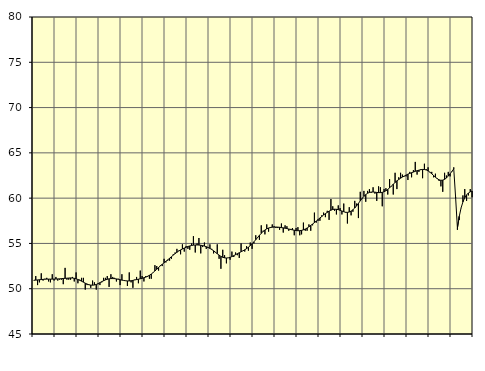
| Category | Piggar | Samtliga anställda (inkl. anställda utomlands) |
|---|---|---|
| nan | 50.9 | 50.94 |
| 1.0 | 51.4 | 50.95 |
| 1.0 | 50.4 | 50.97 |
| 1.0 | 50.7 | 50.99 |
| 1.0 | 51.7 | 51.01 |
| 1.0 | 50.9 | 51.03 |
| 1.0 | 51.1 | 51.05 |
| 1.0 | 51.2 | 51.06 |
| 1.0 | 50.8 | 51.06 |
| 1.0 | 50.7 | 51.06 |
| 1.0 | 51.6 | 51.06 |
| 1.0 | 50.9 | 51.06 |
| nan | 51.3 | 51.07 |
| 2.0 | 50.9 | 51.08 |
| 2.0 | 51 | 51.09 |
| 2.0 | 51 | 51.11 |
| 2.0 | 50.5 | 51.13 |
| 2.0 | 52.3 | 51.15 |
| 2.0 | 51 | 51.16 |
| 2.0 | 51 | 51.18 |
| 2.0 | 51 | 51.19 |
| 2.0 | 51.3 | 51.18 |
| 2.0 | 50.8 | 51.15 |
| 2.0 | 51.8 | 51.1 |
| nan | 50.6 | 51.02 |
| 3.0 | 51 | 50.93 |
| 3.0 | 51.2 | 50.83 |
| 3.0 | 51.2 | 50.72 |
| 3.0 | 49.9 | 50.61 |
| 3.0 | 50.4 | 50.52 |
| 3.0 | 50.4 | 50.44 |
| 3.0 | 50.1 | 50.4 |
| 3.0 | 50.9 | 50.39 |
| 3.0 | 50.7 | 50.41 |
| 3.0 | 49.9 | 50.47 |
| 3.0 | 50.5 | 50.56 |
| nan | 50.4 | 50.67 |
| 4.0 | 50.7 | 50.78 |
| 4.0 | 51.2 | 50.88 |
| 4.0 | 51.2 | 50.97 |
| 4.0 | 51.4 | 51.04 |
| 4.0 | 50.2 | 51.09 |
| 4.0 | 51.6 | 51.12 |
| 4.0 | 51.3 | 51.12 |
| 4.0 | 51.2 | 51.11 |
| 4.0 | 50.8 | 51.08 |
| 4.0 | 51.1 | 51.04 |
| 4.0 | 50.4 | 50.99 |
| nan | 51.6 | 50.95 |
| 5.0 | 50.9 | 50.91 |
| 5.0 | 50.9 | 50.88 |
| 5.0 | 50.3 | 50.86 |
| 5.0 | 51.8 | 50.86 |
| 5.0 | 50.7 | 50.88 |
| 5.0 | 50.1 | 50.92 |
| 5.0 | 51 | 50.97 |
| 5.0 | 51.3 | 51.01 |
| 5.0 | 50.6 | 51.05 |
| 5.0 | 52 | 51.1 |
| 5.0 | 51.4 | 51.15 |
| nan | 50.8 | 51.21 |
| 6.0 | 51.4 | 51.28 |
| 6.0 | 51.3 | 51.37 |
| 6.0 | 51.1 | 51.48 |
| 6.0 | 51.1 | 51.62 |
| 6.0 | 51.8 | 51.78 |
| 6.0 | 52.6 | 51.96 |
| 6.0 | 52.5 | 52.15 |
| 6.0 | 52 | 52.34 |
| 6.0 | 52.6 | 52.53 |
| 6.0 | 52.5 | 52.7 |
| 6.0 | 53.3 | 52.87 |
| nan | 52.9 | 53.03 |
| 7.0 | 53.1 | 53.19 |
| 7.0 | 53.1 | 53.36 |
| 7.0 | 53.3 | 53.53 |
| 7.0 | 53.8 | 53.71 |
| 7.0 | 54 | 53.87 |
| 7.0 | 54.4 | 54.02 |
| 7.0 | 54.2 | 54.16 |
| 7.0 | 53.8 | 54.28 |
| 7.0 | 54.9 | 54.39 |
| 7.0 | 54.1 | 54.49 |
| 7.0 | 54.7 | 54.58 |
| nan | 54.4 | 54.66 |
| 8.0 | 54.3 | 54.72 |
| 8.0 | 55 | 54.77 |
| 8.0 | 55.8 | 54.81 |
| 8.0 | 54 | 54.83 |
| 8.0 | 55 | 54.83 |
| 8.0 | 55.6 | 54.82 |
| 8.0 | 53.9 | 54.8 |
| 8.0 | 54.6 | 54.76 |
| 8.0 | 55.1 | 54.71 |
| 8.0 | 54.4 | 54.64 |
| 8.0 | 54.5 | 54.55 |
| nan | 54.9 | 54.45 |
| 9.0 | 54.4 | 54.33 |
| 9.0 | 53.9 | 54.19 |
| 9.0 | 54 | 54.03 |
| 9.0 | 54.9 | 53.86 |
| 9.0 | 53.3 | 53.71 |
| 9.0 | 52.2 | 53.57 |
| 9.0 | 54.3 | 53.47 |
| 9.0 | 53.7 | 53.41 |
| 9.0 | 52.8 | 53.39 |
| 9.0 | 53.4 | 53.41 |
| 9.0 | 53.2 | 53.46 |
| nan | 54.1 | 53.55 |
| 10.0 | 53.5 | 53.65 |
| 10.0 | 54 | 53.76 |
| 10.0 | 53.7 | 53.87 |
| 10.0 | 53.4 | 53.97 |
| 10.0 | 55 | 54.08 |
| 10.0 | 54.2 | 54.18 |
| 10.0 | 54.1 | 54.3 |
| 10.0 | 54.7 | 54.43 |
| 10.0 | 54.2 | 54.58 |
| 10.0 | 55.1 | 54.76 |
| 10.0 | 54.4 | 54.97 |
| nan | 55 | 55.18 |
| 11.0 | 55.9 | 55.41 |
| 11.0 | 55.6 | 55.65 |
| 11.0 | 55.4 | 55.89 |
| 11.0 | 57 | 56.12 |
| 11.0 | 56.4 | 56.32 |
| 11.0 | 56 | 56.48 |
| 11.0 | 57.1 | 56.61 |
| 11.0 | 56.3 | 56.7 |
| 11.0 | 56.7 | 56.76 |
| 11.0 | 57.1 | 56.79 |
| 11.0 | 56.9 | 56.8 |
| nan | 56.7 | 56.81 |
| 12.0 | 56.7 | 56.8 |
| 12.0 | 56.5 | 56.78 |
| 12.0 | 57.2 | 56.75 |
| 12.0 | 56.2 | 56.72 |
| 12.0 | 57 | 56.68 |
| 12.0 | 56.9 | 56.64 |
| 12.0 | 56.4 | 56.59 |
| 12.0 | 56.6 | 56.54 |
| 12.0 | 56.7 | 56.5 |
| 12.0 | 55.9 | 56.46 |
| 12.0 | 56.7 | 56.42 |
| nan | 56.8 | 56.4 |
| 13.0 | 55.9 | 56.41 |
| 13.0 | 56 | 56.44 |
| 13.0 | 57.3 | 56.5 |
| 13.0 | 56.4 | 56.59 |
| 13.0 | 56.4 | 56.7 |
| 13.0 | 57.1 | 56.84 |
| 13.0 | 56.4 | 56.99 |
| 13.0 | 57 | 57.14 |
| 13.0 | 58.4 | 57.3 |
| 13.0 | 57.3 | 57.47 |
| 13.0 | 57.5 | 57.64 |
| nan | 57.5 | 57.81 |
| 14.0 | 58.1 | 57.97 |
| 14.0 | 58.4 | 58.14 |
| 14.0 | 57.9 | 58.29 |
| 14.0 | 58.6 | 58.43 |
| 14.0 | 57.6 | 58.56 |
| 14.0 | 59.9 | 58.67 |
| 14.0 | 59.1 | 58.75 |
| 14.0 | 58.6 | 58.78 |
| 14.0 | 58.2 | 58.77 |
| 14.0 | 59.2 | 58.73 |
| 14.0 | 58.9 | 58.66 |
| nan | 58.2 | 58.58 |
| 15.0 | 59.4 | 58.5 |
| 15.0 | 58.4 | 58.44 |
| 15.0 | 57.2 | 58.43 |
| 15.0 | 59 | 58.47 |
| 15.0 | 58.1 | 58.57 |
| 15.0 | 58.5 | 58.72 |
| 15.0 | 59.7 | 58.91 |
| 15.0 | 59.4 | 59.15 |
| 15.0 | 57.8 | 59.42 |
| 15.0 | 60.7 | 59.7 |
| 15.0 | 59.9 | 59.96 |
| nan | 60.8 | 60.2 |
| 16.0 | 59.6 | 60.39 |
| 16.0 | 60.8 | 60.54 |
| 16.0 | 61 | 60.63 |
| 16.0 | 60.6 | 60.67 |
| 16.0 | 61.2 | 60.68 |
| 16.0 | 60.5 | 60.66 |
| 16.0 | 59.7 | 60.63 |
| 16.0 | 61.3 | 60.61 |
| 16.0 | 61.2 | 60.61 |
| 16.0 | 59.1 | 60.64 |
| 16.0 | 61 | 60.71 |
| nan | 61.1 | 60.81 |
| 17.0 | 60.4 | 60.96 |
| 17.0 | 62.1 | 61.14 |
| 17.0 | 61.3 | 61.34 |
| 17.0 | 60.4 | 61.54 |
| 17.0 | 62.8 | 61.73 |
| 17.0 | 61 | 61.91 |
| 17.0 | 62.3 | 62.06 |
| 17.0 | 62.8 | 62.2 |
| 17.0 | 62.6 | 62.33 |
| 17.0 | 62.4 | 62.44 |
| 17.0 | 62.4 | 62.55 |
| nan | 62 | 62.65 |
| 18.0 | 62.9 | 62.73 |
| 18.0 | 62.3 | 62.81 |
| 18.0 | 63.1 | 62.88 |
| 18.0 | 64 | 62.96 |
| 18.0 | 62.6 | 63.03 |
| 18.0 | 62.9 | 63.09 |
| 18.0 | 63.2 | 63.14 |
| 18.0 | 62.2 | 63.17 |
| 18.0 | 63.8 | 63.16 |
| 18.0 | 63.2 | 63.11 |
| 18.0 | 63.4 | 63.01 |
| nan | 62.9 | 62.86 |
| 19.0 | 62.9 | 62.69 |
| 19.0 | 62.3 | 62.5 |
| 19.0 | 62.7 | 62.31 |
| 19.0 | 62.2 | 62.15 |
| 19.0 | 61.9 | 62.02 |
| 19.0 | 61.3 | 61.97 |
| 19.0 | 60.7 | 61.99 |
| 19.0 | 62.8 | 62.07 |
| 19.0 | 62.5 | 62.23 |
| 19.0 | 62.9 | 62.43 |
| 19.0 | 62.4 | 62.68 |
| nan | 62.9 | 62.95 |
| 20.0 | 63.4 | 63.23 |
| 20.0 | 60 | 60.12 |
| 20.0 | 56.5 | 56.7 |
| 20.0 | 57.6 | 57.99 |
| 20.0 | 58.9 | 58.92 |
| 20.0 | 60.3 | 59.58 |
| 20.0 | 61 | 60.04 |
| 20.0 | 59.7 | 60.36 |
| 20.0 | 60.3 | 60.57 |
| 20.0 | 61 | 60.7 |
| 20.0 | 60.1 | 60.79 |